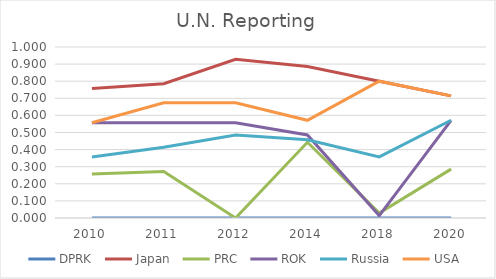
| Category | DPRK  | Japan  | PRC  | ROK  | Russia  | USA  |
|---|---|---|---|---|---|---|
| 2010.0 | 0 | 0.757 | 0.257 | 0.557 | 0.357 | 0.557 |
| 2011.0 | 0 | 0.786 | 0.271 | 0.557 | 0.414 | 0.673 |
| 2012.0 | 0 | 0.929 | 0 | 0.557 | 0.486 | 0.673 |
| 2014.0 | 0 | 0.886 | 0.443 | 0.486 | 0.457 | 0.571 |
| 2018.0 | 0 | 0.8 | 0.029 | 0.014 | 0.357 | 0.8 |
| 2020.0 | 0 | 0.714 | 0.286 | 0.571 | 0.571 | 0.714 |